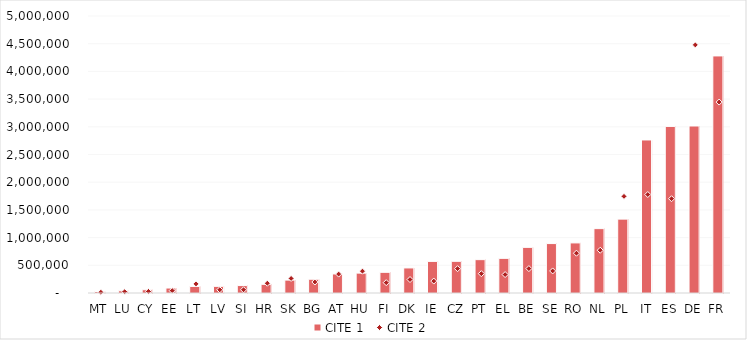
| Category | CITE 1 |
|---|---|
| MT | 27035 |
| LU | 40098 |
| CY | 59195 |
| EE | 89702 |
| LT | 118616 |
| LV | 120051 |
| SI | 134199 |
| HR | 156627 |
| SK | 232979 |
| BG | 248354 |
| AT | 343981 |
| HU | 358766 |
| FI | 373173 |
| DK | 452253 |
| IE | 570381 |
| CZ | 571922 |
| PT | 601972 |
| EL | 625523 |
| BE | 823725 |
| SE | 892231 |
| RO | 904077 |
| NL | 1161942 |
| PL | 1333675 |
| IT | 2762544 |
| ES | 3006992 |
| DE | 3014502 |
| FR | 4279257 |